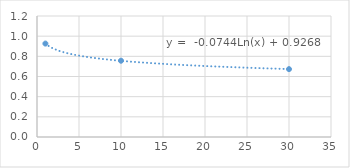
| Category | Series 0 |
|---|---|
| 1.0 | 0.926 |
| 10.0 | 0.756 |
| 30.0 | 0.673 |